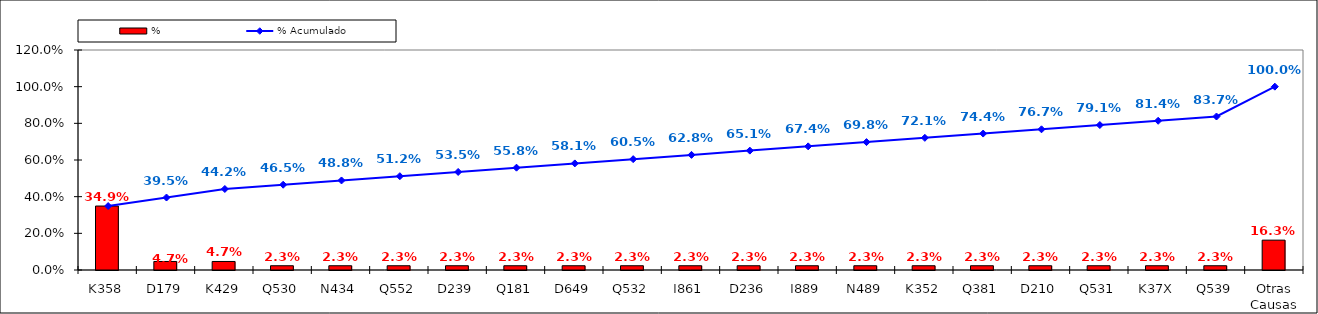
| Category | % |
|---|---|
| K358 | 0.349 |
| D179 | 0.047 |
| K429 | 0.047 |
| Q530 | 0.023 |
| N434 | 0.023 |
| Q552 | 0.023 |
| D239 | 0.023 |
| Q181 | 0.023 |
| D649 | 0.023 |
| Q532 | 0.023 |
| I861 | 0.023 |
| D236 | 0.023 |
| I889 | 0.023 |
| N489 | 0.023 |
| K352 | 0.023 |
| Q381 | 0.023 |
| D210 | 0.023 |
| Q531 | 0.023 |
| K37X | 0.023 |
| Q539 | 0.023 |
| Otras Causas | 0.163 |